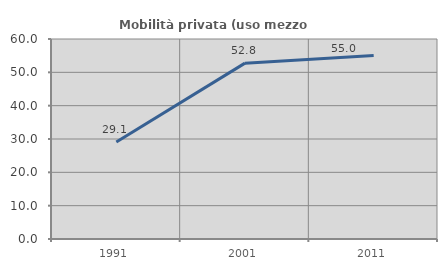
| Category | Mobilità privata (uso mezzo privato) |
|---|---|
| 1991.0 | 29.114 |
| 2001.0 | 52.761 |
| 2011.0 | 55.039 |